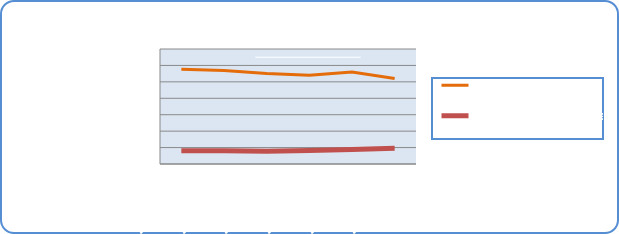
| Category | Motorin Türleri | Benzin Türleri |
|---|---|---|
| 12/2/19 | 57698231.392 | 8108209.527 |
| 12/3/19 | 56974359.214 | 8000756.016 |
| 12/4/19 | 55054372.699 | 7780516.62 |
| 12/5/19 | 54042720.667 | 8147505.247 |
| 12/6/19 | 56037090.662 | 8836280.802 |
| 12/7/19 | 52097883.853 | 9566621.448 |